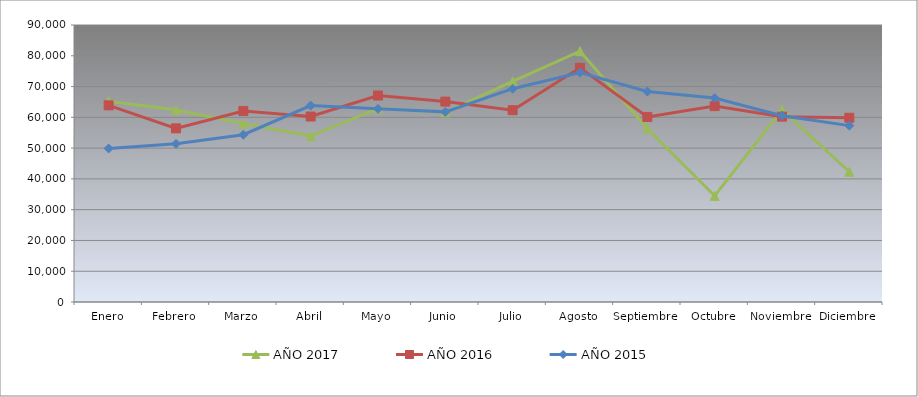
| Category | AÑO 2017 | AÑO 2016 | AÑO 2015 |
|---|---|---|---|
| Enero | 65256.896 | 63893.643 | 49895.521 |
| Febrero | 62377.594 | 56416.493 | 51384.414 |
| Marzo | 57954.833 | 62081.586 | 54345.926 |
| Abril | 53928.181 | 60269.528 | 63813.546 |
| Mayo | 62899.365 | 67093.014 | 62772.135 |
| Junio | 61650.939 | 65118.23 | 61774.116 |
| Julio | 71692.983 | 62321.538 | 69302.65 |
| Agosto | 81472.776 | 76106.414 | 74553.097 |
| Septiembre | 56381.324 | 60131.624 | 68391.415 |
| Octubre | 34488.794 | 63650.932 | 66248.929 |
| Noviembre | 62437.693 | 60225.399 | 60526.592 |
| Diciembre | 42320.823 | 59866.849 | 57310.151 |